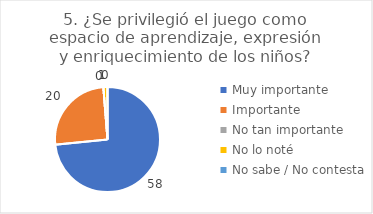
| Category | 5. ¿Se privilegió el juego como espacio de aprendizaje, expresión y enriquecimiento de los niños? |
|---|---|
| Muy importante  | 0.734 |
| Importante  | 0.253 |
| No tan importante  | 0 |
| No lo noté  | 0.013 |
| No sabe / No contesta | 0 |